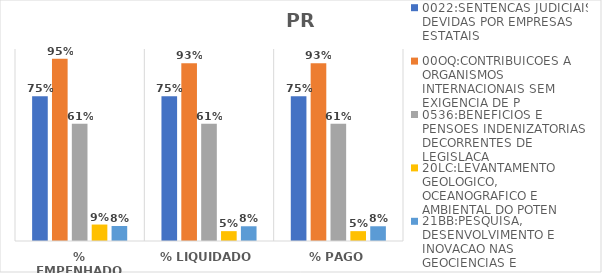
| Category | 0022:SENTENCAS JUDICIAIS DEVIDAS POR EMPRESAS ESTATAIS | 00OQ:CONTRIBUICOES A ORGANISMOS INTERNACIONAIS SEM EXIGENCIA DE P | 0536:BENEFICIOS E PENSOES INDENIZATORIAS DECORRENTES DE LEGISLACA | 20LC:LEVANTAMENTO GEOLOGICO, OCEANOGRAFICO E AMBIENTAL DO POTEN | 21BB:PESQUISA, DESENVOLVIMENTO E INOVACAO NAS GEOCIENCIAS E |
|---|---|---|---|---|---|
| % EMPENHADO | 0.754 | 0.95 | 0.611 | 0.086 | 0.078 |
| % LIQUIDADO | 0.754 | 0.926 | 0.611 | 0.051 | 0.077 |
| % PAGO | 0.754 | 0.926 | 0.611 | 0.051 | 0.077 |